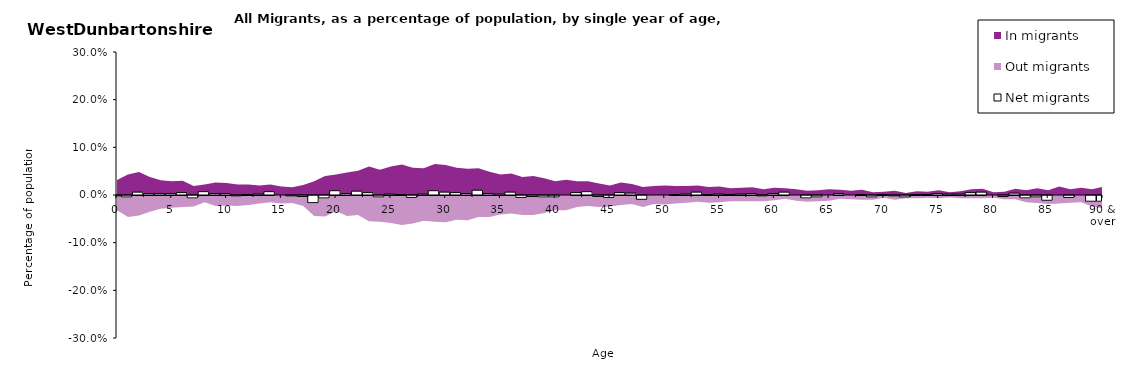
| Category |  Net migrants |
|---|---|
| 0 | -0.001 |
| 1 | -0.003 |
| 2 | 0.006 |
| 3 | 0.003 |
| 4 | 0.003 |
| 5 | 0.003 |
| 6 | 0.005 |
| 7 | -0.005 |
| 8 | 0.007 |
| 9 | 0.003 |
| 10 | 0.003 |
| 11 | -0.001 |
| 12 | 0.001 |
| 13 | 0.002 |
| 14 | 0.007 |
| 15 | 0 |
| 16 | -0.001 |
| 17 | -0.002 |
| 18 | -0.015 |
| 19 | -0.005 |
| 20 | 0.009 |
| 21 | 0.003 |
| 22 | 0.008 |
| 23 | 0.005 |
| 24 | -0.003 |
| 25 | 0.002 |
| 26 | 0.001 |
| 27 | -0.004 |
| 28 | 0.002 |
| 29 | 0.009 |
| 30 | 0.006 |
| 31 | 0.005 |
| 32 | 0.003 |
| 33 | 0.01 |
| 34 | 0.003 |
| 35 | 0.002 |
| 36 | 0.006 |
| 37 | -0.004 |
| 38 | -0.002 |
| 39 | -0.003 |
| 40 | -0.003 |
| 41 | 0 |
| 42 | 0.005 |
| 43 | 0.007 |
| 44 | -0.002 |
| 45 | -0.004 |
| 46 | 0.005 |
| 47 | 0.004 |
| 48 | -0.008 |
| 49 | 0 |
| 50 | 0 |
| 51 | 0.001 |
| 52 | 0.002 |
| 53 | 0.006 |
| 54 | 0.001 |
| 55 | 0.002 |
| 56 | 0.001 |
| 57 | 0.002 |
| 58 | 0.003 |
| 59 | -0.001 |
| 60 | 0.003 |
| 61 | 0.006 |
| 62 | 0 |
| 63 | -0.005 |
| 64 | -0.003 |
| 65 | 0 |
| 66 | 0.003 |
| 67 | 0 |
| 68 | 0.001 |
| 69 | -0.003 |
| 70 | 0.001 |
| 71 | -0.001 |
| 72 | -0.003 |
| 73 | 0.001 |
| 74 | 0.001 |
| 75 | 0.003 |
| 76 | 0.002 |
| 77 | 0.002 |
| 78 | 0.005 |
| 79 | 0.006 |
| 80 | 0 |
| 81 | -0.002 |
| 82 | 0.004 |
| 83 | -0.005 |
| 84 | -0.003 |
| 85 | -0.01 |
| 86 | 0 |
| 87 | -0.004 |
| 88 | 0 |
| 89 | -0.012 |
| 90 & over | -0.012 |